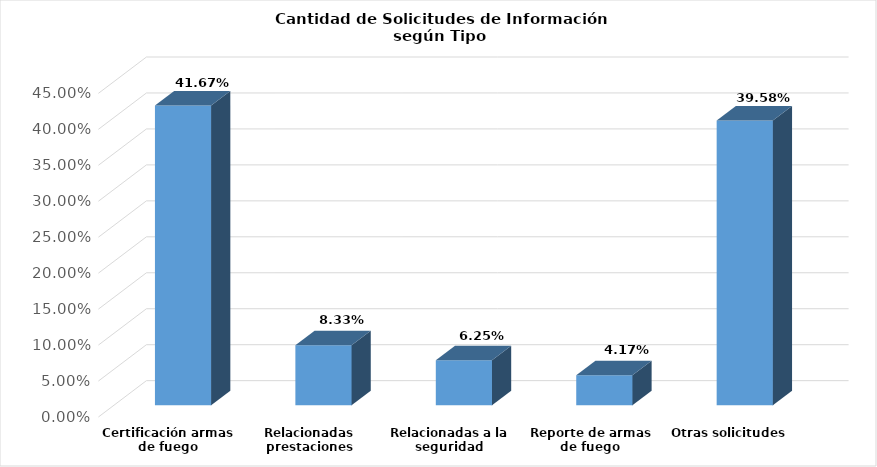
| Category | Series 0 |
|---|---|
| Certificación armas de fuego | 0.417 |
| Relacionadas prestaciones laborales | 0.083 |
| Relacionadas a la seguridad ciudadana | 0.062 |
| Reporte de armas de fuego | 0.042 |
| Otras solicitudes | 0.396 |